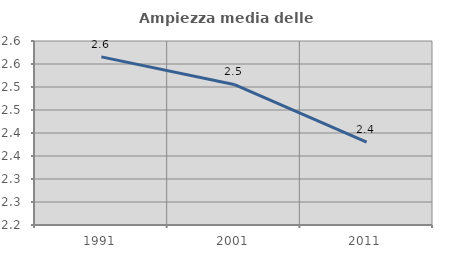
| Category | Ampiezza media delle famiglie |
|---|---|
| 1991.0 | 2.566 |
| 2001.0 | 2.506 |
| 2011.0 | 2.38 |